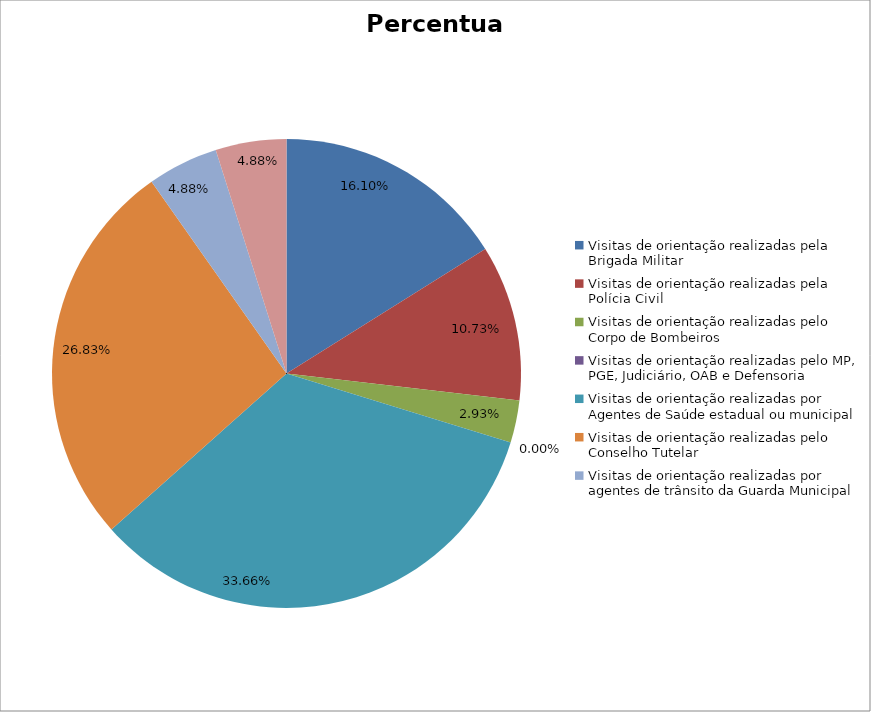
| Category | Percentual |
|---|---|
| Visitas de orientação realizadas pela Brigada Militar | 0.161 |
| Visitas de orientação realizadas pela Polícia Civil | 0.107 |
| Visitas de orientação realizadas pelo Corpo de Bombeiros | 0.029 |
| Visitas de orientação realizadas pelo MP, PGE, Judiciário, OAB e Defensoria | 0 |
| Visitas de orientação realizadas por Agentes de Saúde estadual ou municipal | 0.337 |
| Visitas de orientação realizadas pelo Conselho Tutelar | 0.268 |
| Visitas de orientação realizadas por agentes de trânsito da Guarda Municipal | 0.049 |
| Visitas de orientação realizadas por ONGs, entidades privadas, CRAS e CREAS | 0.049 |